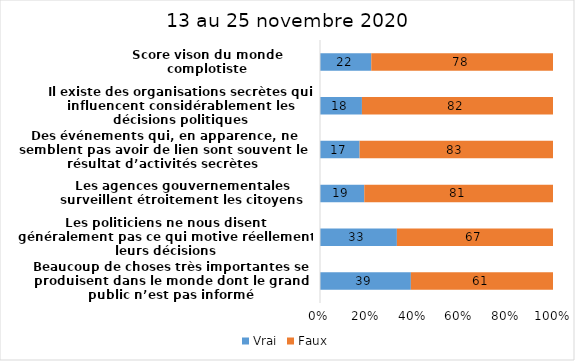
| Category | Vrai | Faux |
|---|---|---|
| Beaucoup de choses très importantes se produisent dans le monde dont le grand public n’est pas informé | 39 | 61 |
| Les politiciens ne nous disent généralement pas ce qui motive réellement leurs décisions | 33 | 67 |
| Les agences gouvernementales surveillent étroitement les citoyens | 19 | 81 |
| Des événements qui, en apparence, ne semblent pas avoir de lien sont souvent le résultat d’activités secrètes | 17 | 83 |
| Il existe des organisations secrètes qui influencent considérablement les décisions politiques | 18 | 82 |
| Score vison du monde complotiste | 22 | 78 |